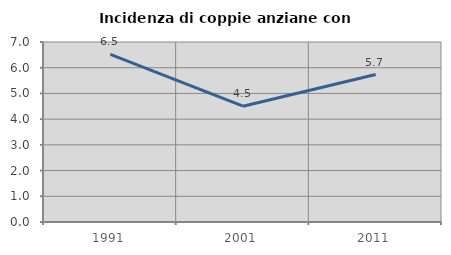
| Category | Incidenza di coppie anziane con figli |
|---|---|
| 1991.0 | 6.522 |
| 2001.0 | 4.505 |
| 2011.0 | 5.735 |